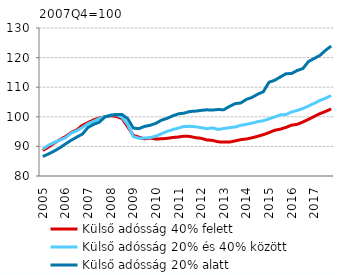
| Category | Külső adósság 40% felett | Külső adósság 20% és 40% között | Külső adósság 20% alatt |
|---|---|---|---|
| 2005 | 88.624 | 89.092 | 86.582 |
|  | 89.795 | 90.408 | 87.451 |
|  | 91.096 | 91.29 | 88.413 |
|  | 92.251 | 92.132 | 89.513 |
| 2006 | 93.3 | 92.909 | 90.82 |
|  | 94.692 | 94.51 | 92.046 |
|  | 95.567 | 95.254 | 93.138 |
|  | 97.122 | 96.394 | 94.166 |
| 2007 | 98.067 | 97.694 | 96.415 |
|  | 98.973 | 98.454 | 97.465 |
|  | 99.614 | 99.445 | 98.199 |
|  | 100 | 100 | 100 |
| 2008 | 100.394 | 100.648 | 100.427 |
|  | 100.121 | 100.698 | 100.79 |
|  | 99.426 | 99.833 | 100.782 |
|  | 96.655 | 97.436 | 99.401 |
| 2009 | 93.727 | 93.31 | 96.206 |
|  | 93.105 | 92.758 | 96.004 |
|  | 92.536 | 92.814 | 96.754 |
|  | 92.802 | 92.973 | 97.135 |
| 2010 | 92.496 | 93.485 | 97.805 |
|  | 92.568 | 94.279 | 98.883 |
|  | 92.723 | 95.104 | 99.478 |
|  | 93.013 | 95.675 | 100.344 |
| 2011 | 93.173 | 96.22 | 101.006 |
|  | 93.472 | 96.744 | 101.242 |
|  | 93.363 | 96.77 | 101.786 |
|  | 92.951 | 96.648 | 101.915 |
| 2012 | 92.735 | 96.331 | 102.165 |
|  | 92.194 | 95.975 | 102.351 |
|  | 92.034 | 96.264 | 102.293 |
|  | 91.552 | 95.713 | 102.463 |
| 2013 | 91.456 | 96.055 | 102.379 |
|  | 91.46 | 96.337 | 103.498 |
|  | 91.858 | 96.539 | 104.442 |
|  | 92.283 | 97.127 | 104.664 |
| 2014 | 92.496 | 97.457 | 105.883 |
|  | 92.905 | 97.858 | 106.551 |
|  | 93.415 | 98.361 | 107.636 |
|  | 93.967 | 98.663 | 108.465 |
| 2015 | 94.655 | 99.302 | 111.684 |
|  | 95.449 | 99.931 | 112.324 |
|  | 95.826 | 100.662 | 113.447 |
|  | 96.42 | 100.779 | 114.545 |
| 2016 | 97.187 | 101.633 | 114.633 |
|  | 97.465 | 102.125 | 115.655 |
|  | 98.239 | 102.8 | 116.311 |
|  | 99.172 | 103.645 | 118.678 |
| 2017 | 100.125 | 104.561 | 119.711 |